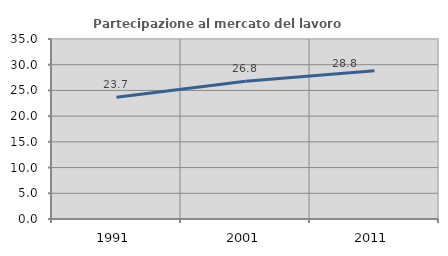
| Category | Partecipazione al mercato del lavoro  femminile |
|---|---|
| 1991.0 | 23.671 |
| 2001.0 | 26.804 |
| 2011.0 | 28.814 |